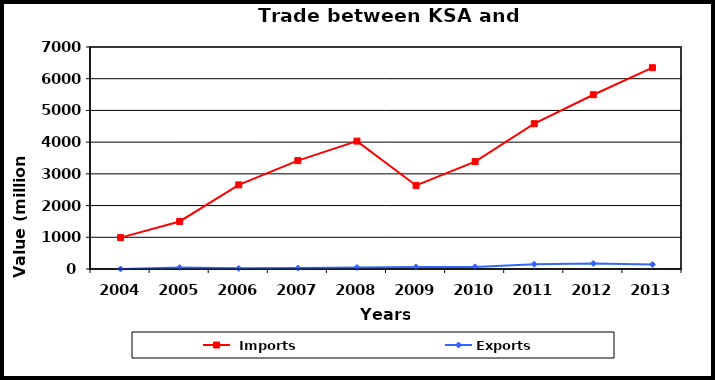
| Category |  Imports | Exports |
|---|---|---|
| 2004.0 | 990 | 2 |
| 2005.0 | 1499 | 46 |
| 2006.0 | 2653 | 20 |
| 2007.0 | 3418 | 31 |
| 2008.0 | 4033 | 48 |
| 2009.0 | 2634 | 63 |
| 2010.0 | 3386 | 67 |
| 2011.0 | 4582 | 151 |
| 2012.0 | 5495 | 174 |
| 2013.0 | 6348 | 143 |